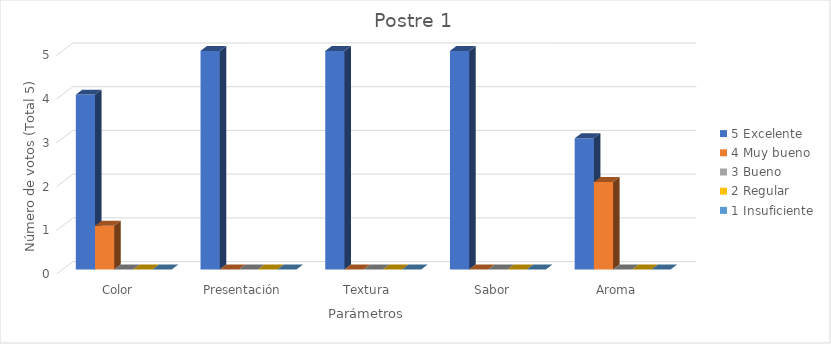
| Category | 5 | 4 | 3 | 2 | 1 |
|---|---|---|---|---|---|
| Color | 4 | 1 | 0 | 0 | 0 |
| Presentación | 5 | 0 | 0 | 0 | 0 |
| Textura | 5 | 0 | 0 | 0 | 0 |
| Sabor | 5 | 0 | 0 | 0 | 0 |
| Aroma | 3 | 2 | 0 | 0 | 0 |